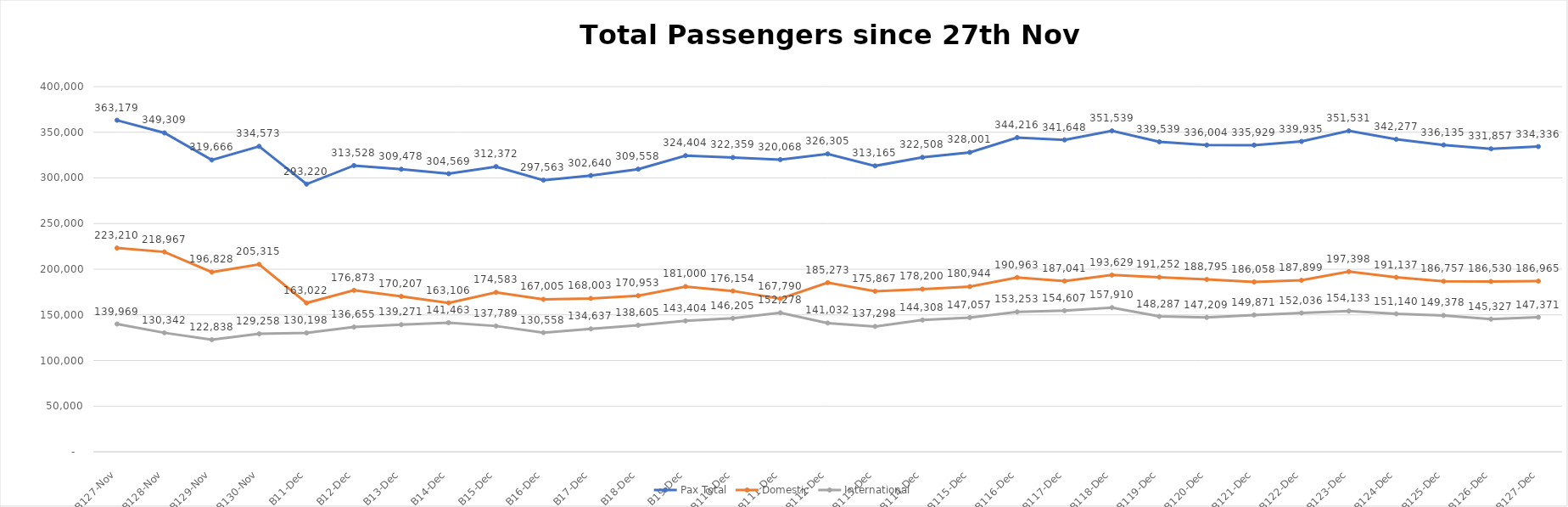
| Category | Pax Total |  Domestic  |  International  |
|---|---|---|---|
| 2022-11-27 | 363179 | 223210 | 139969 |
| 2022-11-28 | 349309 | 218967 | 130342 |
| 2022-11-29 | 319666 | 196828 | 122838 |
| 2022-11-30 | 334573 | 205315 | 129258 |
| 2022-12-01 | 293220 | 163022 | 130198 |
| 2022-12-02 | 313528 | 176873 | 136655 |
| 2022-12-03 | 309478 | 170207 | 139271 |
| 2022-12-04 | 304569 | 163106 | 141463 |
| 2022-12-05 | 312372 | 174583 | 137789 |
| 2022-12-06 | 297563 | 167005 | 130558 |
| 2022-12-07 | 302640 | 168003 | 134637 |
| 2022-12-08 | 309558 | 170953 | 138605 |
| 2022-12-09 | 324404 | 181000 | 143404 |
| 2022-12-10 | 322359 | 176154 | 146205 |
| 2022-12-11 | 320068 | 167790 | 152278 |
| 2022-12-12 | 326305 | 185273 | 141032 |
| 2022-12-13 | 313165 | 175867 | 137298 |
| 2022-12-14 | 322508 | 178200 | 144308 |
| 2022-12-15 | 328001 | 180944 | 147057 |
| 2022-12-16 | 344216 | 190963 | 153253 |
| 2022-12-17 | 341648 | 187041 | 154607 |
| 2022-12-18 | 351539 | 193629 | 157910 |
| 2022-12-19 | 339539 | 191252 | 148287 |
| 2022-12-20 | 336004 | 188795 | 147209 |
| 2022-12-21 | 335929 | 186058 | 149871 |
| 2022-12-22 | 339935 | 187899 | 152036 |
| 2022-12-23 | 351531 | 197398 | 154133 |
| 2022-12-24 | 342277 | 191137 | 151140 |
| 2022-12-25 | 336135 | 186757 | 149378 |
| 2022-12-26 | 331857 | 186530 | 145327 |
| 2022-12-27 | 334336 | 186965 | 147371 |